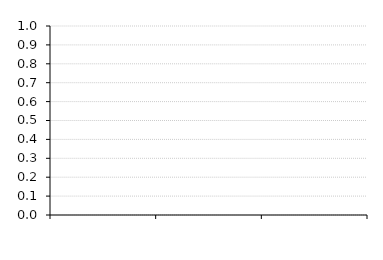
| Category | Cost of GS to  Inventory |
|---|---|
| 0 | 0 |
| 1 | 0 |
| 2 | 0 |